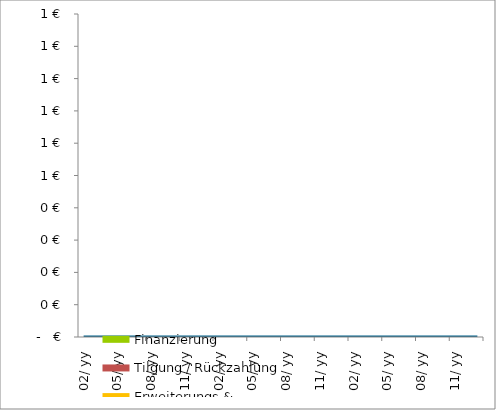
| Category | Finanzierung | Tilgung / Rückzahlung | Erweiterungs & Ersatzinvestitionen |
|---|---|---|---|
| 2019-02-01 | 0 | 0 | 0 |
| 2019-03-01 | 0 | 0 | 0 |
| 2019-04-01 | 0 | 0 | 0 |
| 2019-05-01 | 0 | 0 | 0 |
| 2019-06-01 | 0 | 0 | 0 |
| 2019-07-01 | 0 | 0 | 0 |
| 2019-08-01 | 0 | 0 | 0 |
| 2019-09-01 | 0 | 0 | 0 |
| 2019-10-01 | 0 | 0 | 0 |
| 2019-11-01 | 0 | 0 | 0 |
| 2019-12-01 | 0 | 0 | 0 |
| 2020-01-01 | 0 | 0 | 0 |
| 2020-02-01 | 0 | 0 | 0 |
| 2020-03-01 | 0 | 0 | 0 |
| 2020-04-01 | 0 | 0 | 0 |
| 2020-05-01 | 0 | 0 | 0 |
| 2020-06-01 | 0 | 0 | 0 |
| 2020-07-01 | 0 | 0 | 0 |
| 2020-08-01 | 0 | 0 | 0 |
| 2020-09-01 | 0 | 0 | 0 |
| 2020-10-01 | 0 | 0 | 0 |
| 2020-11-01 | 0 | 0 | 0 |
| 2020-12-01 | 0 | 0 | 0 |
| 2021-01-01 | 0 | 0 | 0 |
| 2021-02-01 | 0 | 0 | 0 |
| 2021-03-01 | 0 | 0 | 0 |
| 2021-04-01 | 0 | 0 | 0 |
| 2021-05-01 | 0 | 0 | 0 |
| 2021-06-01 | 0 | 0 | 0 |
| 2021-07-01 | 0 | 0 | 0 |
| 2021-08-01 | 0 | 0 | 0 |
| 2021-09-01 | 0 | 0 | 0 |
| 2021-10-01 | 0 | 0 | 0 |
| 2021-11-01 | 0 | 0 | 0 |
| 2021-12-01 | 0 | 0 | 0 |
| 2022-01-01 | 0 | 0 | 0 |